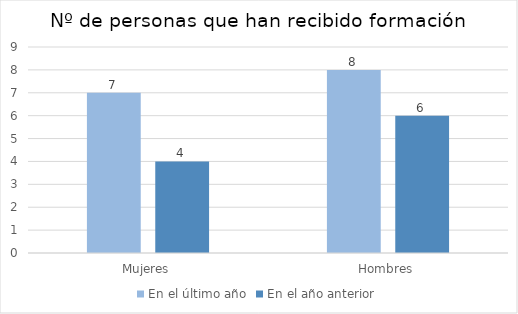
| Category | En el último año | En el año anterior |
|---|---|---|
| Mujeres | 7 | 4 |
| Hombres | 8 | 6 |